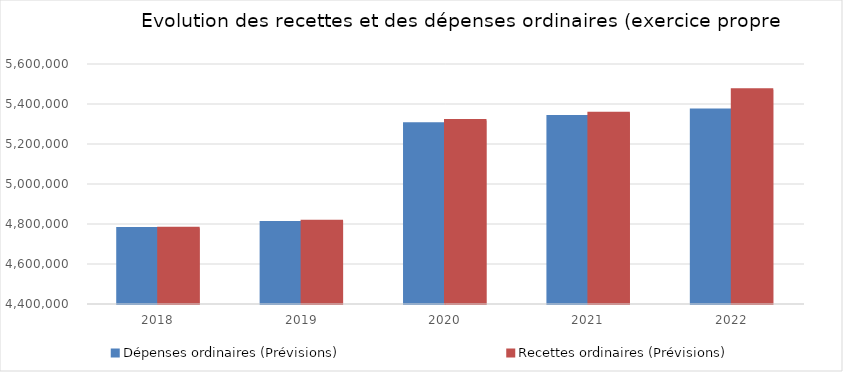
| Category | Dépenses ordinaires (Prévisions) | Recettes ordinaires (Prévisions) |
|---|---|---|
| 2018.0 | 4777110.11 | 4778843.92 |
| 2019.0 | 4807906.54 | 4814257.92 |
| 2020.0 | 5301105.39 | 5317195.83 |
| 2021.0 | 5337789.03 | 5353904.68 |
| 2022.0 | 5369697.11 | 5470809.58 |